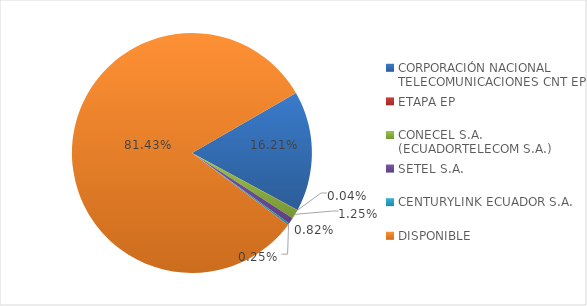
| Category | CODIGO DE AREA 2 |
|---|---|
| CORPORACIÓN NACIONAL TELECOMUNICACIONES CNT EP | 0.162 |
| ETAPA EP | 0 |
| CONECEL S.A. (ECUADORTELECOM S.A.) | 0.012 |
| SETEL S.A. | 0.008 |
| CENTURYLINK ECUADOR S.A. | 0.002 |
| DISPONIBLE | 0.814 |